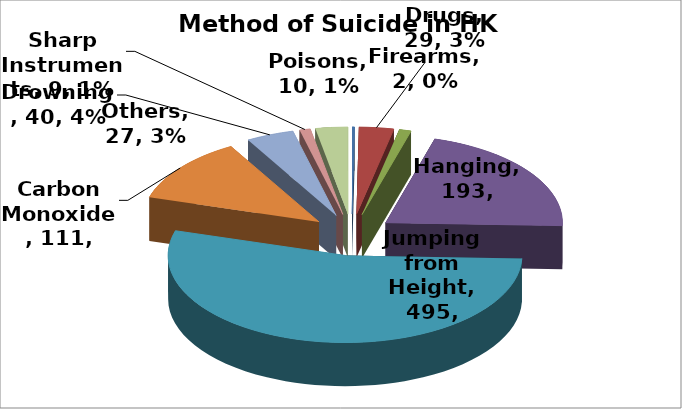
| Category | Series 0 |
|---|---|
| Firearms | 2 |
| Drugs | 29 |
| Poisons | 10 |
| Hanging | 193 |
| Jumping from Height | 495 |
| Carbon Monoxide | 111 |
| Drowning | 40 |
| Sharp Instruments | 9 |
| Others | 27 |